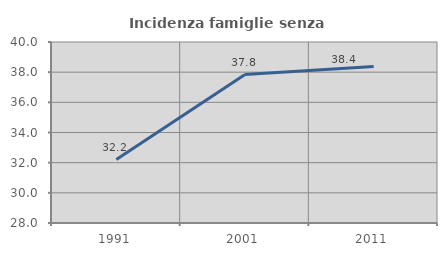
| Category | Incidenza famiglie senza nuclei |
|---|---|
| 1991.0 | 32.203 |
| 2001.0 | 37.838 |
| 2011.0 | 38.378 |